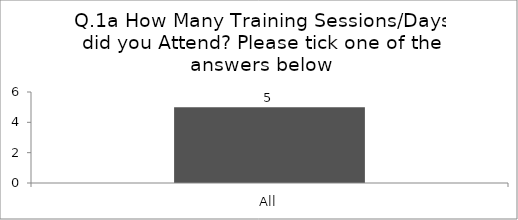
| Category | Q.1a How Many Training Sessions/Days did you Attend? Please tick one of the answers below |
|---|---|
| All | 5 |